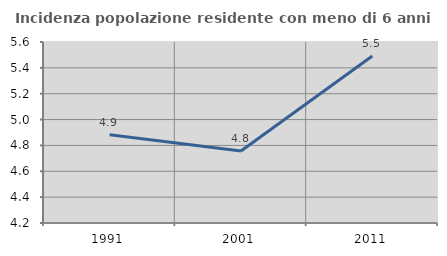
| Category | Incidenza popolazione residente con meno di 6 anni |
|---|---|
| 1991.0 | 4.882 |
| 2001.0 | 4.757 |
| 2011.0 | 5.492 |